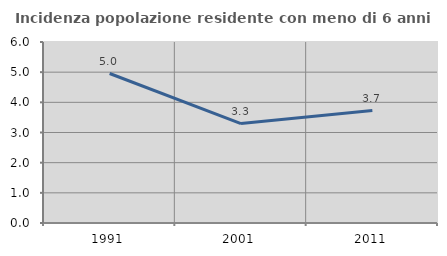
| Category | Incidenza popolazione residente con meno di 6 anni |
|---|---|
| 1991.0 | 4.955 |
| 2001.0 | 3.297 |
| 2011.0 | 3.727 |